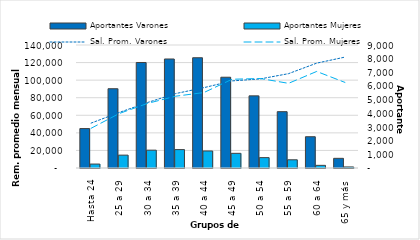
| Category | Aportantes Varones | Aportantes Mujeres |
|---|---|---|
| Hasta 24 | 2885 | 289 |
| 25 a 29 | 5800 | 942 |
| 30 a 34 | 7720 | 1305 |
| 35 a 39 | 7976 | 1346 |
| 40 a 44 | 8068 | 1246 |
| 45 a 49 | 6642 | 1073 |
| 50 a 54 | 5279 | 759 |
| 55 a 59 | 4121 | 601 |
| 60 a 64 | 2288 | 194 |
| 65 y más | 707 | 77 |